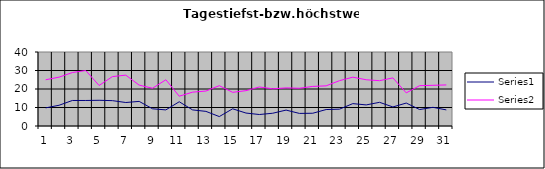
| Category | Series 0 | Series 1 |
|---|---|---|
| 0 | 9.8 | 25 |
| 1 | 11.2 | 26.4 |
| 2 | 13.8 | 28.9 |
| 3 | 13.8 | 30 |
| 4 | 13.9 | 21.9 |
| 5 | 13.7 | 26.7 |
| 6 | 12.7 | 27.5 |
| 7 | 13.3 | 22.1 |
| 8 | 9.3 | 20.4 |
| 9 | 8.7 | 25 |
| 10 | 13.1 | 16.1 |
| 11 | 8.7 | 18.3 |
| 12 | 7.9 | 18.9 |
| 13 | 5.1 | 21.8 |
| 14 | 9.3 | 18.2 |
| 15 | 7 | 19.1 |
| 16 | 6.2 | 21.1 |
| 17 | 6.9 | 20.1 |
| 18 | 8.6 | 20.6 |
| 19 | 6.8 | 20.4 |
| 20 | 6.9 | 21.4 |
| 21 | 8.9 | 21.7 |
| 22 | 9.1 | 24.5 |
| 23 | 12.1 | 26.4 |
| 24 | 11.4 | 25 |
| 25 | 12.8 | 24.5 |
| 26 | 10.3 | 26 |
| 27 | 12.4 | 17.9 |
| 28 | 8.9 | 21.8 |
| 29 | 10.1 | 22 |
| 30 | 8.7 | 22.2 |